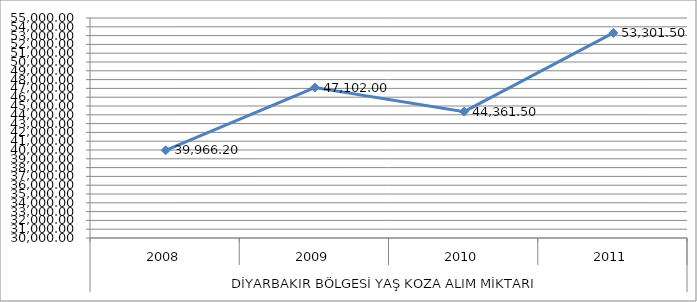
| Category | DİYARBAKIR |
|---|---|
| 0 | 39966.2 |
| 1 | 47102 |
| 2 | 44361.5 |
| 3 | 53301.5 |